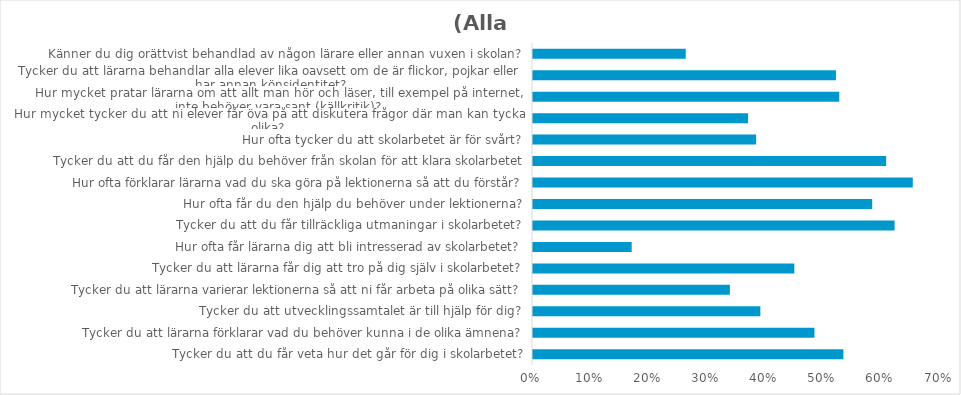
| Category | (Alla) |
|---|---|
| Tycker du att du får veta hur det går för dig i skolarbetet? | 0.534 |
| Tycker du att lärarna förklarar vad du behöver kunna i de olika ämnena? | 0.484 |
| Tycker du att utvecklingssamtalet är till hjälp för dig? | 0.391 |
| Tycker du att lärarna varierar lektionerna så att ni får arbeta på olika sätt? | 0.339 |
| Tycker du att lärarna får dig att tro på dig själv i skolarbetet? | 0.449 |
| Hur ofta får lärarna dig att bli intresserad av skolarbetet? | 0.17 |
| Tycker du att du får tillräckliga utmaningar i skolarbetet? | 0.622 |
| Hur ofta får du den hjälp du behöver under lektionerna? | 0.583 |
| Hur ofta förklarar lärarna vad du ska göra på lektionerna så att du förstår? | 0.653 |
| Tycker du att du får den hjälp du behöver från skolan för att klara skolarbetet | 0.607 |
| Hur ofta tycker du att skolarbetet är för svårt? | 0.384 |
| Hur mycket tycker du att ni elever får öva på att diskutera frågor där man kan tycka olika? | 0.37 |
| Hur mycket pratar lärarna om att allt man hör och läser, till exempel på internet, inte behöver vara sant (källkritik)? | 0.527 |
| Tycker du att lärarna behandlar alla elever lika oavsett om de är flickor, pojkar eller har annan könsidentitet? | 0.521 |
| Känner du dig orättvist behandlad av någon lärare eller annan vuxen i skolan? | 0.263 |